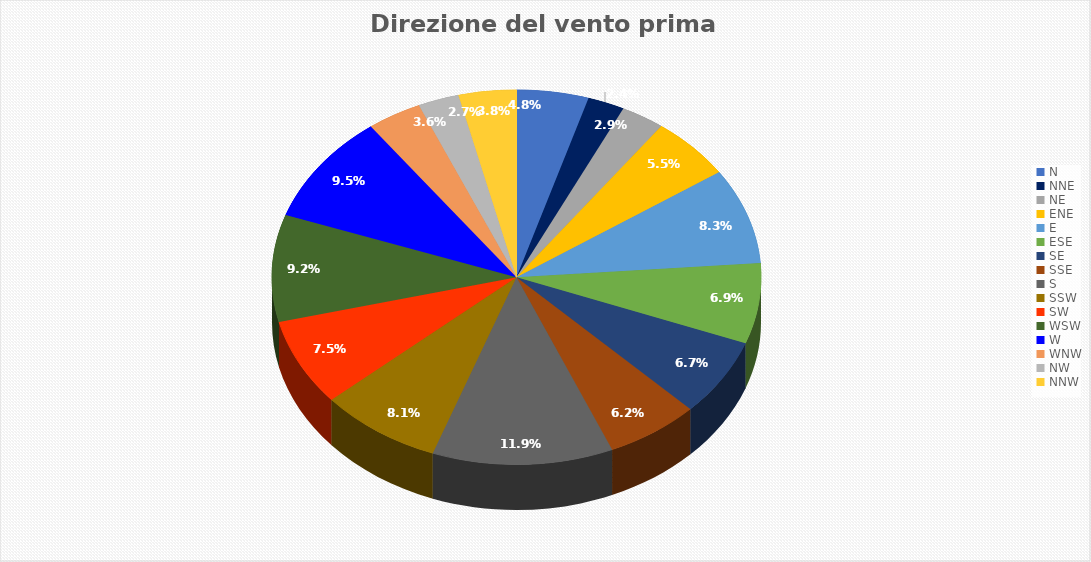
| Category | Percentuale |
|---|---|
| N | 4.757 |
| NNE | 2.431 |
| NE | 2.882 |
| ENE | 5.451 |
| E | 8.264 |
| ESE | 6.944 |
| SE | 6.701 |
| SSE | 6.181 |
| S | 11.944 |
| SSW | 8.09 |
| SW | 7.5 |
| WSW | 9.236 |
| W | 9.479 |
| WNW | 3.611 |
| NW | 2.708 |
| NNW | 3.819 |